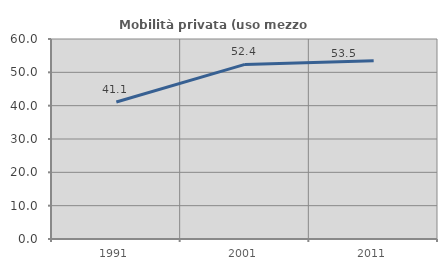
| Category | Mobilità privata (uso mezzo privato) |
|---|---|
| 1991.0 | 41.089 |
| 2001.0 | 52.373 |
| 2011.0 | 53.485 |